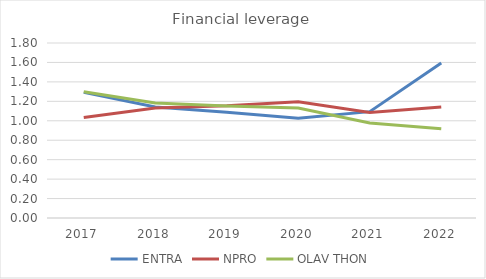
| Category | ENTRA | NPRO | OLAV THON |
|---|---|---|---|
| 2017.0 | 1.292 | 1.035 | 1.298 |
| 2018.0 | 1.142 | 1.132 | 1.183 |
| 2019.0 | 1.087 | 1.154 | 1.152 |
| 2020.0 | 1.025 | 1.196 | 1.131 |
| 2021.0 | 1.094 | 1.086 | 0.978 |
| 2022.0 | 1.594 | 1.142 | 0.918 |